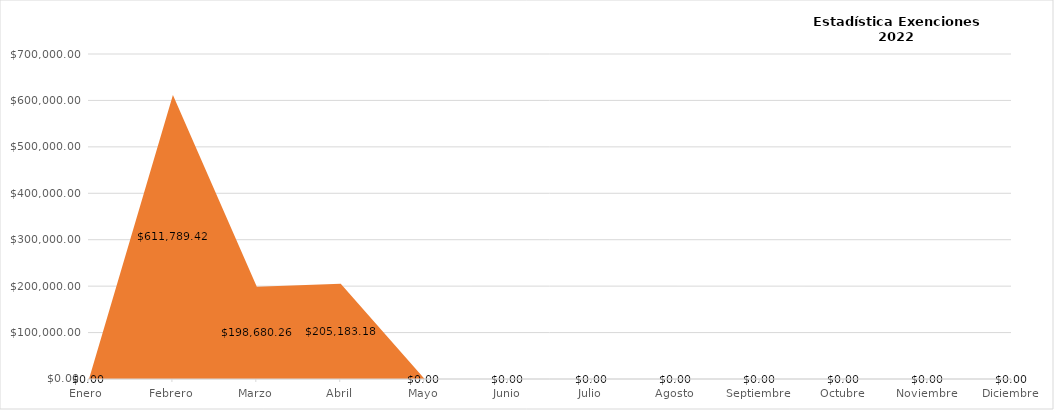
| Category | Total de Monto Condonado |
|---|---|
| Enero  | 0 |
| Febrero | 611789.42 |
| Marzo | 198680.26 |
| Abril | 205183.18 |
| Mayo | 0 |
| Junio | 0 |
| Julio | 0 |
| Agosto | 0 |
| Septiembre | 0 |
| Octubre | 0 |
| Noviembre | 0 |
| Diciembre | 0 |